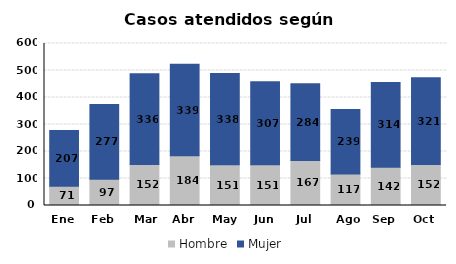
| Category | Hombre | Mujer |
|---|---|---|
| Ene | 71 | 207 |
| Feb | 97 | 277 |
| Mar | 152 | 336 |
| Abr | 184 | 339 |
| May | 151 | 338 |
| Jun | 151 | 307 |
| Jul | 167 | 284 |
| Ago | 117 | 239 |
| Sep | 142 | 314 |
| Oct | 152 | 321 |